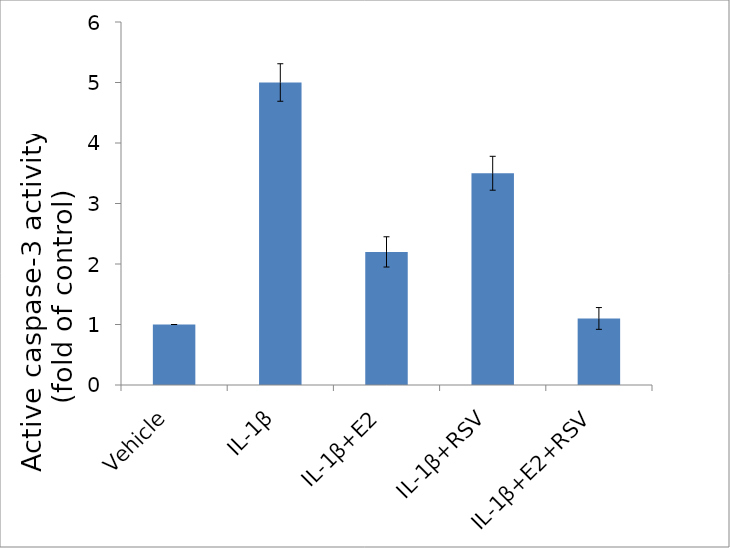
| Category | Series 0 |
|---|---|
| Vehicle | 1 |
| IL-1β | 5 |
| IL-1β+E2 | 2.2 |
| IL-1β+RSV | 3.5 |
| IL-1β+E2+RSV | 1.1 |